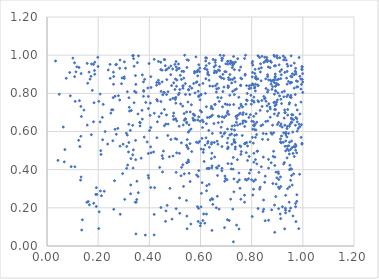
| Category | Series 0 |
|---|---|
| 0.4397582424768291 | 0.85 |
| 0.9306065013908572 | 0.698 |
| 0.45905064466568135 | 0.716 |
| 0.7237459221952459 | 0.629 |
| 0.627939035113636 | 0.539 |
| 0.6833654984516622 | 0.972 |
| 0.8725762796969696 | 0.675 |
| 0.16093497196341988 | 0.233 |
| 0.592542413880383 | 0.197 |
| 0.4730334914781309 | 0.808 |
| 0.8861221907580672 | 0.594 |
| 0.6947858666441654 | 0.339 |
| 0.683654880736637 | 0.394 |
| 0.3955928365395567 | 0.37 |
| 0.5476568008945845 | 0.09 |
| 0.6479818516568191 | 0.218 |
| 0.8899949662903974 | 0.072 |
| 0.7726067595610066 | 0.626 |
| 0.6707475994850652 | 0.827 |
| 0.9288758335606171 | 0.713 |
| 0.9922326241957272 | 0.875 |
| 0.7067391578996007 | 0.706 |
| 0.8201820290631205 | 0.43 |
| 0.6106738642838067 | 0.65 |
| 0.7044417234368779 | 0.54 |
| 0.6294474489301293 | 0.548 |
| 0.5413794025680093 | 0.794 |
| 0.9792913036521915 | 0.862 |
| 0.8780104582182556 | 0.189 |
| 0.37267117728008076 | 0.896 |
| 0.2768716669511784 | 0.616 |
| 0.9480298406155264 | 0.4 |
| 0.6199840227202453 | 0.986 |
| 0.6619571355454509 | 0.913 |
| 0.18266965576157063 | 0.224 |
| 0.8361605614147365 | 0.63 |
| 0.3117633460813789 | 0.522 |
| 0.790365009153304 | 0.839 |
| 0.5014256973000555 | 0.563 |
| 0.801803901243772 | 0.959 |
| 0.7383309946841438 | 0.679 |
| 0.2526202056550569 | 0.713 |
| 0.8339017023034863 | 0.912 |
| 0.6952844717494677 | 0.914 |
| 0.5971870194827564 | 0.933 |
| 0.7336272615109689 | 0.631 |
| 0.5660099925702582 | 0.827 |
| 0.7288850378932779 | 0.957 |
| 0.5933533301236843 | 0.95 |
| 0.6692634076765457 | 0.681 |
| 0.8923122747983209 | 0.901 |
| 0.9721107230061647 | 0.738 |
| 0.8552057277014337 | 0.876 |
| 0.8475790365505581 | 0.784 |
| 0.9308096741542663 | 0.699 |
| 0.6450869756310679 | 0.42 |
| 0.5359674929827138 | 0.694 |
| 0.6190773410810242 | 0.8 |
| 0.8329864053565965 | 0.308 |
| 0.772175240070705 | 0.983 |
| 0.9383104013218859 | 0.953 |
| 0.3350387867544831 | 0.478 |
| 0.5523770347545228 | 0.596 |
| 0.9250413176067294 | 0.975 |
| 0.6000381439607686 | 0.791 |
| 0.4057358930435871 | 0.621 |
| 0.7595085625792112 | 0.495 |
| 0.7986880469913847 | 0.743 |
| 0.6522755969845091 | 0.642 |
| 0.4194467273299296 | 0.696 |
| 0.5466725327784752 | 0.157 |
| 0.7324114684003323 | 0.793 |
| 0.8550696682368828 | 0.653 |
| 0.806328378153701 | 0.844 |
| 0.6020656587611511 | 0.205 |
| 0.4190033491986625 | 0.165 |
| 0.9703848851121417 | 0.794 |
| 0.7326744415356399 | 0.924 |
| 0.9029811242468271 | 0.802 |
| 0.6768479442541693 | 1 |
| 0.4404542227759458 | 0.412 |
| 0.6426695310158304 | 0.458 |
| 0.9472907652219515 | 0.628 |
| 0.7761549709987637 | 1 |
| 0.46326782165340946 | 0.129 |
| 0.128500594103624 | 0.521 |
| 0.45808541655429097 | 0.977 |
| 0.1344220684928971 | 0.679 |
| 0.6714808646532138 | 0.42 |
| 0.9802851968661976 | 0.834 |
| 0.7227599620286055 | 0.533 |
| 0.5476559091503768 | 0.976 |
| 0.4817701208243884 | 0.767 |
| 0.27179629245290976 | 0.952 |
| 0.4582539838530219 | 0.804 |
| 0.5174969212528008 | 0.486 |
| 0.928099881278443 | 0.811 |
| 0.16577344483976106 | 0.216 |
| 0.6108727488720841 | 0.491 |
| 0.31403229731486565 | 0.808 |
| 0.8123347312741905 | 0.904 |
| 0.9943878482873181 | 0.846 |
| 0.5457206383565661 | 0.702 |
| 0.9385067285459505 | 0.462 |
| 0.7283064310556521 | 0.464 |
| 0.5857476662627418 | 0.913 |
| 0.28437573407253375 | 0.765 |
| 0.8476666464722052 | 0.962 |
| 0.4446778232376353 | 0.963 |
| 0.5528912196933847 | 0.973 |
| 0.714909511922426 | 0.899 |
| 0.726097819725797 | 0.193 |
| 0.6582129797654425 | 0.974 |
| 0.9054849382932397 | 0.196 |
| 0.263945958838259 | 0.342 |
| 0.8347812338674323 | 0.955 |
| 0.7441785159034859 | 0.452 |
| 0.5179235221876486 | 0.252 |
| 0.6554074812832449 | 0.918 |
| 0.978014111455429 | 0.602 |
| 0.3197570025185871 | 0.638 |
| 0.5966648548342794 | 0.548 |
| 0.8973264029374248 | 0.752 |
| 0.6834927672056559 | 0.985 |
| 0.6650257340749395 | 0.849 |
| 0.48884590701903197 | 0.141 |
| 0.741009175812642 | 0.109 |
| 0.9049097139846919 | 0.379 |
| 0.5993736760383804 | 0.106 |
| 0.7789724845145493 | 0.489 |
| 0.8029887373958056 | 0.569 |
| 0.20873162991225366 | 0.288 |
| 0.8906480461428249 | 0.882 |
| 0.9135301137160078 | 0.877 |
| 0.8569139575846726 | 0.588 |
| 0.9336825593443574 | 0.582 |
| 0.6648367952596044 | 0.549 |
| 0.6552610683249024 | 0.466 |
| 0.9881876928510416 | 0.626 |
| 0.9717037782528212 | 0.206 |
| 0.2709669070166084 | 0.585 |
| 0.840784952578503 | 0.731 |
| 0.9615437111511197 | 0.157 |
| 0.0752330270776588 | 0.879 |
| 0.6675978947679491 | 0.778 |
| 0.3843443753921758 | 0.057 |
| 0.9098107727249628 | 0.987 |
| 0.886687853121969 | 0.752 |
| 0.3636486608411398 | 0.629 |
| 0.06757905644450751 | 0.441 |
| 0.17415501083521728 | 0.954 |
| 0.8526609079278437 | 0.132 |
| 0.7001294252184086 | 0.912 |
| 0.19301128861674618 | 0.306 |
| 0.6042471286513494 | 0.702 |
| 0.6559565395820836 | 0.742 |
| 0.778521484543587 | 0.691 |
| 0.8671423556707127 | 0.746 |
| 0.9295267946281064 | 0.633 |
| 0.3200716660214945 | 0.542 |
| 0.7292195772132313 | 0.993 |
| 0.13576714626574882 | 0.084 |
| 0.9280402782555909 | 0.437 |
| 0.7940986808306106 | 0.546 |
| 0.7648530476050951 | 0.689 |
| 0.905989669473316 | 0.349 |
| 0.8593733833149108 | 0.987 |
| 0.9290235429054389 | 0.09 |
| 0.6954909473677985 | 0.594 |
| 0.6665997862081255 | 0.37 |
| 0.9726858438960366 | 0.673 |
| 0.8120204125184383 | 0.609 |
| 0.9056504279604051 | 0.875 |
| 0.9547303136482571 | 0.778 |
| 0.22728748999846282 | 0.6 |
| 0.2854671600535836 | 0.523 |
| 0.7078144893543508 | 0.519 |
| 0.9978623721093367 | 0.873 |
| 0.9249161931790494 | 0.593 |
| 0.3405799540827344 | 0.942 |
| 0.28549859494760416 | 0.974 |
| 0.7071028473175551 | 0.565 |
| 0.772064888886028 | 0.266 |
| 0.40088916529883634 | 0.605 |
| 0.8249988537032112 | 0.196 |
| 0.764256107716562 | 0.729 |
| 0.5043405717286213 | 0.966 |
| 0.956470822949223 | 0.857 |
| 0.7178688076475236 | 0.245 |
| 0.5046179421882743 | 0.938 |
| 0.7998688682587701 | 0.347 |
| 0.9561568080405116 | 0.55 |
| 0.405796986752596 | 0.887 |
| 0.06369873648318244 | 0.623 |
| 0.7297657459621126 | 0.741 |
| 0.643721035615434 | 0.41 |
| 0.21626446475492636 | 0.674 |
| 0.8512992015559172 | 0.989 |
| 0.4600756055984458 | 0.977 |
| 0.32280928368547335 | 0.707 |
| 0.7506452984735504 | 0.089 |
| 0.704971641212876 | 0.697 |
| 0.9445942750561502 | 0.59 |
| 0.8130062444618413 | 0.834 |
| 0.4842982283725431 | 0.558 |
| 0.6764771922721993 | 0.887 |
| 0.1907557632537843 | 0.27 |
| 0.13119193756320596 | 0.345 |
| 0.340425235328573 | 0.751 |
| 0.8505088533787807 | 0.772 |
| 0.6076904006754811 | 0.621 |
| 0.7178189693155569 | 0.873 |
| 0.15598364822997682 | 0.229 |
| 0.6004841881846844 | 0.119 |
| 0.5836501632658271 | 0.857 |
| 0.9840563760734663 | 0.091 |
| 0.12527609103149326 | 0.935 |
| 0.5910541176758058 | 0.81 |
| 0.9967520239593749 | 0.538 |
| 0.5417601212198916 | 0.666 |
| 0.536660113120931 | 0.378 |
| 0.7200952417454632 | 0.404 |
| 0.33497940721588515 | 0.633 |
| 0.9532053968276173 | 0.789 |
| 0.24711499053800134 | 0.879 |
| 0.6529362121278061 | 0.939 |
| 0.3575578873032818 | 0.997 |
| 0.9873271934120542 | 0.376 |
| 0.8984598607150192 | 0.357 |
| 0.2075782404318102 | 0.65 |
| 0.8817115414730372 | 0.633 |
| 0.9251681802679272 | 0.43 |
| 0.913402082103097 | 0.144 |
| 0.8148092712689423 | 0.453 |
| 0.6365866434000123 | 0.838 |
| 0.5823099655253737 | 0.991 |
| 0.6024335985289277 | 0.794 |
| 0.9501260295517759 | 0.853 |
| 0.6847414355846674 | 0.678 |
| 0.45287333171246524 | 0.459 |
| 0.9047321245259362 | 0.845 |
| 0.6928400171269505 | 0.673 |
| 0.7749526458169351 | 0.54 |
| 0.7276537164617517 | 0.403 |
| 0.42841625753314244 | 0.842 |
| 0.8869406969678225 | 0.999 |
| 0.6695280034562198 | 0.922 |
| 0.5509173140791381 | 0.755 |
| 0.7575674883557049 | 0.88 |
| 0.8033240132623437 | 0.91 |
| 0.10127520197496556 | 0.984 |
| 0.6140268317693196 | 0.443 |
| 0.6096043672017895 | 0.852 |
| 0.47833119720412726 | 0.468 |
| 0.6746718681869771 | 0.94 |
| 0.4698667691678758 | 0.213 |
| 0.36236454568616333 | 0.648 |
| 0.30380434805095496 | 0.244 |
| 0.7548897008068617 | 0.695 |
| 0.6918806689814829 | 0.587 |
| 0.1995789252691707 | 0.941 |
| 0.7039730214280847 | 0.347 |
| 0.9557090888999689 | 0.369 |
| 0.8213752064961062 | 0.496 |
| 0.7329581750357338 | 0.548 |
| 0.9326393539542939 | 0.174 |
| 0.6953681367594868 | 0.367 |
| 0.5313854888896647 | 0.826 |
| 0.884070524171767 | 0.469 |
| 0.9576853639201416 | 0.515 |
| 0.8135335085496259 | 0.926 |
| 0.9390027333543158 | 0.508 |
| 0.9638244978731638 | 0.378 |
| 0.8797301039294866 | 0.585 |
| 0.7335799470401801 | 0.58 |
| 0.2913126820844504 | 0.85 |
| 0.6384264889476642 | 0.241 |
| 0.9383727708650739 | 0.848 |
| 0.7577195908331642 | 0.48 |
| 0.9378261046701984 | 0.571 |
| 0.9329993775249009 | 0.266 |
| 0.7897527820734499 | 0.825 |
| 0.1322804789881547 | 0.575 |
| 0.8931094928199063 | 0.814 |
| 0.2690088508758282 | 0.95 |
| 0.6860968598795508 | 0.729 |
| 0.6323168391732525 | 0.606 |
| 0.6270578813814057 | 0.673 |
| 0.7401320176136307 | 0.648 |
| 0.43149100870509427 | 0.651 |
| 0.9270412657977214 | 0.67 |
| 0.8909109748626789 | 0.466 |
| 0.3818133725040228 | 0.873 |
| 0.10767000283172662 | 0.96 |
| 0.6164502444612769 | 0.93 |
| 0.04277510151570869 | 0.449 |
| 0.9383155314214834 | 0.615 |
| 0.5599288610829584 | 0.703 |
| 0.7339793131148543 | 0.817 |
| 0.8663436219162478 | 0.135 |
| 0.3940512308593839 | 0.828 |
| 0.4354093628040043 | 0.968 |
| 0.6585926227296713 | 0.84 |
| 0.907486193780197 | 0.949 |
| 0.9478239562979881 | 0.544 |
| 0.9721366931927745 | 0.912 |
| 0.8948887928138027 | 0.811 |
| 0.558103736442747 | 0.794 |
| 0.903756483611857 | 0.388 |
| 0.5468694376664684 | 0.936 |
| 0.9635302784001093 | 0.662 |
| 0.9644842453515979 | 0.521 |
| 0.7721972538403773 | 0.536 |
| 0.6214975960028959 | 0.567 |
| 0.20258668387123918 | 0.758 |
| 0.6342073030580457 | 0.957 |
| 0.5009856217987457 | 0.774 |
| 0.9373905382287913 | 0.783 |
| 0.8140254716205799 | 0.639 |
| 0.6413728795622653 | 0.722 |
| 0.1323585290870167 | 0.731 |
| 0.7801532112422994 | 0.765 |
| 0.15735276555535976 | 0.634 |
| 0.900574054337971 | 0.636 |
| 0.966599307594584 | 0.958 |
| 0.4503115197978316 | 0.473 |
| 0.27915740293504526 | 0.788 |
| 0.20406522393300977 | 0.179 |
| 0.048002066363245215 | 0.795 |
| 0.863275429781671 | 0.655 |
| 0.5365755803726542 | 0.659 |
| 0.7633150451915186 | 0.579 |
| 0.7722121767343232 | 0.229 |
| 0.42956704102181137 | 0.567 |
| 0.7306973728610897 | 0.352 |
| 0.7364073712718966 | 0.964 |
| 0.641016004079567 | 0.679 |
| 0.9113689854145689 | 0.168 |
| 0.9193591676338525 | 0.623 |
| 0.6844919243712689 | 0.574 |
| 0.5223886270704037 | 0.745 |
| 0.9658052426322717 | 0.898 |
| 0.6346642572054112 | 0.517 |
| 0.8732332223941051 | 0.969 |
| 0.33745249567191776 | 0.998 |
| 0.9528447538738447 | 0.405 |
| 0.790230808259809 | 0.469 |
| 0.5309175241245954 | 0.426 |
| 0.7669183985114635 | 0.699 |
| 0.6236419253433851 | 0.289 |
| 0.7574282411804071 | 0.521 |
| 0.888906339003526 | 0.944 |
| 0.09125663644659217 | 0.787 |
| 0.8893547025487426 | 0.214 |
| 0.8616971853195803 | 0.806 |
| 0.925804261104407 | 0.782 |
| 0.8086095876797492 | 0.439 |
| 0.8660820194980356 | 0.408 |
| 0.31021970955999456 | 0.591 |
| 0.5905454488080464 | 0.922 |
| 0.511677647508238 | 0.929 |
| 0.4050015646725836 | 0.519 |
| 0.8909879497326996 | 0.735 |
| 0.807615867350336 | 0.651 |
| 0.9143068638427397 | 0.769 |
| 0.9300447147616225 | 0.987 |
| 0.5719408606368248 | 0.691 |
| 0.658749520598123 | 0.946 |
| 0.3771929921947803 | 0.784 |
| 0.31400644686461987 | 0.581 |
| 0.5022559265387744 | 0.875 |
| 0.9317662481246844 | 0.198 |
| 0.5735837317458974 | 0.689 |
| 0.34584374171806487 | 0.893 |
| 0.377754419086543 | 0.815 |
| 0.9306590191834921 | 0.523 |
| 0.6875705143875184 | 0.809 |
| 0.8269690435156477 | 0.756 |
| 0.7310768682445552 | 0.544 |
| 0.16813161498970658 | 0.874 |
| 0.40553789429519205 | 0.307 |
| 0.6231406454349024 | 0.641 |
| 0.5983551639823474 | 0.766 |
| 0.7449677804589271 | 0.633 |
| 0.8650427792334697 | 0.938 |
| 0.6477471133566293 | 0.837 |
| 0.7071818943540101 | 0.953 |
| 0.9413620759191175 | 0.942 |
| 0.8896786310614159 | 0.87 |
| 0.8075012633479544 | 0.759 |
| 0.6838753749929544 | 0.521 |
| 0.899172732252995 | 0.997 |
| 0.5984717712034879 | 0.654 |
| 0.7169331959878289 | 0.955 |
| 0.7077388127858865 | 0.831 |
| 0.8837314683452675 | 0.868 |
| 0.6968024377208917 | 0.744 |
| 0.46419912556103327 | 0.922 |
| 0.7217553941247067 | 0.854 |
| 0.727199028557434 | 0.961 |
| 0.7514422067314047 | 0.723 |
| 0.5929545219011392 | 0.677 |
| 0.7910412057631161 | 0.382 |
| 0.7257643552894264 | 0.946 |
| 0.6064049901106701 | 0.332 |
| 0.6622374903368426 | 0.909 |
| 0.7353053690954604 | 0.86 |
| 0.9760382143322068 | 0.488 |
| 0.9364601292404071 | 0.88 |
| 0.5779525101868769 | 0.659 |
| 0.9764525048838149 | 0.667 |
| 0.2573327728150806 | 0.551 |
| 0.5702004911179603 | 0.67 |
| 0.09437030183568973 | 0.416 |
| 0.5080295730922351 | 0.869 |
| 0.8664512950473483 | 0.87 |
| 0.19862493518261815 | 0.989 |
| 0.9543460136038999 | 0.996 |
| 0.39591630602648303 | 0.485 |
| 0.5348402828142416 | 0.88 |
| 0.7497746006931828 | 0.779 |
| 0.9767573279313749 | 0.269 |
| 0.7828862827491727 | 0.799 |
| 0.9958225264964806 | 0.926 |
| 0.8444046191148235 | 0.181 |
| 0.5562537895796988 | 0.604 |
| 0.45492366267047624 | 0.497 |
| 0.7752794716475954 | 0.349 |
| 0.8925721100044943 | 0.888 |
| 0.7139379317727739 | 0.74 |
| 0.3782078684789347 | 0.811 |
| 0.5458536222928128 | 0.649 |
| 0.774359293058749 | 0.895 |
| 0.6991214328752569 | 0.954 |
| 0.3533247935655623 | 0.961 |
| 0.20997098180163556 | 0.5 |
| 0.9995302081348104 | 0.859 |
| 0.7802727511111209 | 0.345 |
| 0.2660563952142053 | 0.785 |
| 0.612127321763619 | 0.506 |
| 0.9717304232193864 | 0.502 |
| 0.5991131155535181 | 0.71 |
| 0.14441217314347402 | 0.712 |
| 0.9057536938091564 | 0.696 |
| 0.16443372750943527 | 0.911 |
| 0.6493858697671615 | 0.977 |
| 0.9449945537182584 | 0.525 |
| 0.9550965893297102 | 0.67 |
| 0.6534009197847379 | 0.907 |
| 0.3714163061043407 | 0.711 |
| 0.9661543551997518 | 0.827 |
| 0.5552788745730051 | 0.635 |
| 0.9885584063460031 | 0.692 |
| 0.6680577492714033 | 0.533 |
| 0.9447030185513792 | 0.5 |
| 0.6073600719967427 | 0.66 |
| 0.8085145129333529 | 0.486 |
| 0.5064105209721986 | 0.921 |
| 0.5061868303599949 | 0.837 |
| 0.4525208417623794 | 0.792 |
| 0.5066500152016172 | 0.488 |
| 0.7211981398417424 | 0.431 |
| 0.5453339862194542 | 0.528 |
| 0.9699580513113201 | 0.916 |
| 0.3680944734384801 | 0.46 |
| 0.9568231733893174 | 0.665 |
| 0.7566279123156068 | 0.842 |
| 0.6623454993203645 | 0.411 |
| 0.8623161462387768 | 0.888 |
| 0.576368646710749 | 0.907 |
| 0.7991223092247441 | 0.843 |
| 0.5073190716734 | 0.559 |
| 0.7285762267821341 | 0.022 |
| 0.5556260725051432 | 0.381 |
| 0.7548461778026151 | 0.639 |
| 0.7094715485555365 | 0.835 |
| 0.6324249347674801 | 0.896 |
| 0.9327216717150141 | 0.498 |
| 0.5623190617868857 | 0.115 |
| 0.11670459450904669 | 0.939 |
| 0.5933334121029632 | 0.786 |
| 0.5911982141877167 | 0.541 |
| 0.8772266558133017 | 0.862 |
| 0.8956918027311016 | 0.741 |
| 0.10902680532328327 | 0.415 |
| 0.6437336374317945 | 0.543 |
| 0.8008972789323073 | 0.763 |
| 0.4735554824061505 | 0.639 |
| 0.5017908197074367 | 0.768 |
| 0.6479259949366393 | 0.245 |
| 0.35569491826592486 | 0.692 |
| 0.6994402329345224 | 0.682 |
| 0.44741831551215067 | 0.695 |
| 0.588119265435381 | 0.206 |
| 0.4952048128694363 | 0.697 |
| 0.7660489869024587 | 0.655 |
| 0.7449105299165746 | 0.336 |
| 0.6425418710658981 | 0.534 |
| 0.7076771760443981 | 0.839 |
| 0.8971088044200781 | 0.844 |
| 0.5036670099445745 | 0.748 |
| 0.35691960533679784 | 0.28 |
| 0.7970808545523853 | 0.79 |
| 0.7047147400772913 | 0.741 |
| 0.9393174665378741 | 0.523 |
| 0.9821393435837774 | 0.616 |
| 0.8331046888662332 | 0.711 |
| 0.9853371174019026 | 0.639 |
| 0.9092017239550689 | 0.787 |
| 0.7877520503893366 | 0.353 |
| 0.4515248126605207 | 0.388 |
| 0.7057699002690104 | 0.967 |
| 0.858401886105906 | 0.976 |
| 0.6724051224375442 | 0.678 |
| 0.49520854850770696 | 0.855 |
| 0.6257871621664433 | 0.406 |
| 0.5520140914185067 | 0.51 |
| 0.6859914005234733 | 0.983 |
| 0.9583485420458052 | 0.32 |
| 0.5926095680074123 | 0.783 |
| 0.8957794562277853 | 0.324 |
| 0.2586587460809253 | 0.777 |
| 0.7963676716264636 | 0.399 |
| 0.8925022271983564 | 0.837 |
| 0.20210926118341077 | 0.091 |
| 0.8619033738934636 | 0.707 |
| 0.7540042189656043 | 0.525 |
| 0.565564556125157 | 0.495 |
| 0.8990476181887813 | 0.871 |
| 0.8312559500308712 | 0.298 |
| 0.3017467832823765 | 0.886 |
| 0.6977476467204735 | 0.353 |
| 0.8377003498734362 | 0.934 |
| 0.547340582560207 | 0.437 |
| 0.8508955842159112 | 0.334 |
| 0.4287190629268465 | 0.857 |
| 0.940922843552737 | 0.686 |
| 0.8242742092570335 | 0.761 |
| 0.7544634026481551 | 0.302 |
| 0.17715394481415841 | 0.816 |
| 0.2973707125061305 | 0.533 |
| 0.3185987199246789 | 0.493 |
| 0.8143177793328796 | 0.88 |
| 0.8162364740971702 | 0.888 |
| 0.8303852502249235 | 0.988 |
| 0.9854633110000619 | 0.988 |
| 0.956537271071971 | 0.689 |
| 0.22366002756531614 | 0.287 |
| 0.9106070608501289 | 0.915 |
| 0.7807477279601323 | 0.542 |
| 0.8762427272847193 | 0.436 |
| 0.5344627606167861 | 0.914 |
| 0.8255471987557786 | 0.84 |
| 0.5034640079121577 | 0.779 |
| 0.3068609239454137 | 0.931 |
| 0.8887930224161574 | 0.856 |
| 0.8470272622844268 | 0.193 |
| 0.6328866432808256 | 0.406 |
| 0.7505800263541649 | 0.69 |
| 0.49974601882258934 | 0.952 |
| 0.8186284859397923 | 0.876 |
| 0.39910678506194164 | 0.956 |
| 0.7891155428104654 | 0.674 |
| 0.4040487585549022 | 0.749 |
| 0.1866974013666697 | 0.963 |
| 0.8067630218850814 | 0.632 |
| 0.5768761316892562 | 0.915 |
| 0.4835448475793458 | 0.898 |
| 0.7107364259470631 | 0.871 |
| 0.8465838436708267 | 0.241 |
| 0.3487421172283794 | 0.23 |
| 0.6575325025850626 | 0.742 |
| 0.8242019116861888 | 0.876 |
| 0.23944088583046516 | 0.923 |
| 0.5209410717153448 | 0.895 |
| 0.9568597731290482 | 0.648 |
| 0.9046994722486161 | 0.308 |
| 0.6222792906805105 | 0.945 |
| 0.32972805708251 | 0.71 |
| 0.4032028552107226 | 0.685 |
| 0.4573059051262478 | 0.806 |
| 0.8976738568246455 | 0.852 |
| 0.8901750081580033 | 0.422 |
| 0.9335465145350124 | 0.596 |
| 0.7360768964952152 | 0.543 |
| 0.23723640328683065 | 0.534 |
| 0.504775214650162 | 0.386 |
| 0.8771006727124563 | 0.963 |
| 0.5837366380804777 | 0.544 |
| 0.7760323166920454 | 0.537 |
| 0.436910383225852 | 0.855 |
| 0.2129153464970628 | 0.263 |
| 0.11299510689083399 | 0.912 |
| 0.6477328736530771 | 0.719 |
| 0.7050443432663019 | 0.138 |
| 0.7330664650047649 | 0.608 |
| 0.8230293854156107 | 0.497 |
| 0.644495271912072 | 0.248 |
| 0.7143759147095476 | 0.581 |
| 0.39749687386849464 | 0.356 |
| 0.9745924668387753 | 0.865 |
| 0.9437029654439902 | 0.862 |
| 0.950456811035251 | 0.78 |
| 0.6319804681746662 | 0.407 |
| 0.311200734451991 | 0.407 |
| 0.48054610717710905 | 0.302 |
| 0.1720832573118226 | 0.889 |
| 0.3421369431141265 | 0.811 |
| 0.49996521092571194 | 0.82 |
| 0.6242338878570604 | 0.316 |
| 0.6632013986250631 | 0.823 |
| 0.3800041619326859 | 0.571 |
| 0.4501027722646903 | 0.86 |
| 0.9295550527359767 | 0.91 |
| 0.5303845328599232 | 0.733 |
| 0.18165480514217458 | 0.951 |
| 0.46867976010567186 | 0.926 |
| 0.644592514138406 | 0.082 |
| 0.8621724792119373 | 0.972 |
| 0.416761075847265 | 0.493 |
| 0.34623242978135393 | 0.553 |
| 0.2605842254949567 | 0.888 |
| 0.9962677664694655 | 0.939 |
| 0.8403045926779702 | 0.994 |
| 0.9323778217305586 | 0.188 |
| 0.7124481829154162 | 0.134 |
| 0.36429881252080065 | 0.645 |
| 0.2112542071559908 | 0.48 |
| 0.9612299437373506 | 0.687 |
| 0.2657662263110686 | 0.611 |
| 0.9418571195767648 | 0.791 |
| 0.6179502711275329 | 0.929 |
| 0.7578994285825571 | 0.743 |
| 0.327365576610013 | 0.32 |
| 0.9546409817547337 | 0.648 |
| 0.8948256467352117 | 0.387 |
| 0.9403848864414255 | 0.301 |
| 0.9992244569010617 | 0.904 |
| 0.6735806428860701 | 0.758 |
| 0.91174186795795 | 0.63 |
| 0.44520372025370275 | 0.757 |
| 0.7362872518030178 | 0.519 |
| 0.7356875143673933 | 0.508 |
| 0.9980912248731872 | 0.939 |
| 0.9482419533691643 | 0.751 |
| 0.8613060839913339 | 0.966 |
| 0.8851931614268699 | 0.867 |
| 0.47222594936327955 | 0.579 |
| 0.8884839477979161 | 0.692 |
| 0.4063235417693632 | 0.831 |
| 0.7570926139032974 | 0.938 |
| 0.8369572550549146 | 0.866 |
| 0.9137457279278554 | 0.312 |
| 0.08859858180728693 | 0.909 |
| 0.872966014179253 | 0.869 |
| 0.3476316560728441 | 0.063 |
| 0.5956426379460177 | 0.844 |
| 0.5643777180042086 | 0.74 |
| 0.9733828573492266 | 0.901 |
| 0.8102114013204098 | 0.629 |
| 0.8110221468609817 | 0.828 |
| 0.37703341297063736 | 0.86 |
| 0.2601298517258737 | 0.847 |
| 0.39627088603439037 | 0.72 |
| 0.4645718292059551 | 0.639 |
| 0.5322964775590321 | 0.634 |
| 0.971720359207996 | 0.223 |
| 0.828283234956335 | 0.929 |
| 0.9235486080579157 | 0.544 |
| 0.8192832985253917 | 0.584 |
| 0.6178068231238305 | 0.529 |
| 0.7420442791326882 | 0.667 |
| 0.6621381188252041 | 0.806 |
| 0.705275431042495 | 0.51 |
| 0.33663486782665725 | 0.409 |
| 0.4909889721340182 | 0.928 |
| 0.5631113868096896 | 0.613 |
| 0.19267355064163386 | 0.207 |
| 0.9349211647425589 | 0.974 |
| 0.133302191504126 | 0.362 |
| 0.7260575796304463 | 0.873 |
| 0.6939376778171334 | 0.096 |
| 0.5594221971750233 | 0.338 |
| 0.7428242243010414 | 0.682 |
| 0.8729187189956303 | 0.718 |
| 0.8094227918931025 | 0.754 |
| 0.8168172732015406 | 0.608 |
| 0.6207689159229719 | 0.876 |
| 0.8898141452376609 | 0.993 |
| 0.5893560960215231 | 0.892 |
| 0.28627827447174137 | 0.166 |
| 0.6427418379634366 | 0.732 |
| 0.7591213765107552 | 0.734 |
| 0.8170087731460449 | 0.694 |
| 0.8759583461624324 | 0.848 |
| 0.2077622522866688 | 0.796 |
| 0.5048049093934597 | 0.195 |
| 0.7453958149330172 | 0.982 |
| 0.6658065498936202 | 0.261 |
| 0.777603287251048 | 0.743 |
| 0.4068578257419469 | 0.488 |
| 0.7175591960425473 | 0.959 |
| 0.6202454242485174 | 0.97 |
| 0.8755238967916023 | 0.593 |
| 0.9201375707887172 | 0.206 |
| 0.8621520061181469 | 0.897 |
| 0.8451597999123093 | 0.59 |
| 0.5530131206307651 | 0.82 |
| 0.961723604637486 | 0.485 |
| 0.946492461997466 | 0.743 |
| 0.3348748120445132 | 0.997 |
| 0.6350410811866388 | 0.674 |
| 0.8422588170065753 | 0.559 |
| 0.6335825486636922 | 0.869 |
| 0.7082168186154038 | 0.513 |
| 0.9933596558900214 | 0.569 |
| 0.5138031759075337 | 0.793 |
| 0.5467635806881079 | 0.436 |
| 0.7840028714003007 | 0.524 |
| 0.8041424105698766 | 0.612 |
| 0.4922677766252274 | 0.774 |
| 0.06983769454853675 | 0.505 |
| 0.48420844665144464 | 0.943 |
| 0.13340483157331254 | 0.904 |
| 0.7968631135178891 | 0.827 |
| 0.44969431904667123 | 0.921 |
| 0.8021104582670051 | 0.154 |
| 0.44594909484184897 | 0.81 |
| 0.538157073676725 | 1 |
| 0.9158504324107183 | 0.897 |
| 0.4682330553684578 | 0.872 |
| 0.5933154368747932 | 0.395 |
| 0.9521395703346948 | 0.199 |
| 0.6746321593508933 | 0.919 |
| 0.8907479290786313 | 0.754 |
| 0.476297036440389 | 0.934 |
| 0.8644814675660629 | 0.816 |
| 0.795018591606048 | 0.688 |
| 0.18658398698005563 | 0.9 |
| 0.9927157071406891 | 0.754 |
| 0.7257121385243984 | 0.811 |
| 0.949853619686599 | 0.638 |
| 0.8396831052263438 | 0.763 |
| 0.4937443197679632 | 0.681 |
| 0.5189981322133586 | 0.171 |
| 0.43804325408194483 | 0.678 |
| 0.1237868423368455 | 0.554 |
| 0.5337455050497082 | 0.312 |
| 0.7732741553929248 | 0.655 |
| 0.9541614533784325 | 0.945 |
| 0.7304740959050776 | 0.284 |
| 0.9995078395184136 | 0.805 |
| 0.9334726860148049 | 0.591 |
| 0.757063770730143 | 0.84 |
| 0.5892980332181431 | 0.66 |
| 0.6239790107095271 | 0.985 |
| 0.806533300820085 | 0.539 |
| 0.8562839004120061 | 0.758 |
| 0.6091898707371303 | 0.134 |
| 0.7309153681154232 | 0.557 |
| 0.5239793626573284 | 0.368 |
| 0.5962536949594691 | 0.914 |
| 0.5320033740086024 | 0.84 |
| 0.6463834333019265 | 0.59 |
| 0.6824510637726816 | 0.88 |
| 0.8532858706209441 | 0.968 |
| 0.466890774928336 | 0.687 |
| 0.5015214898443082 | 0.666 |
| 0.9386127625587058 | 0.915 |
| 0.1818278452666692 | 0.651 |
| 0.9125562054713491 | 0.561 |
| 0.8147889042655404 | 0.569 |
| 0.2174109215128717 | 0.557 |
| 0.3203525949323387 | 0.777 |
| 0.9575065169603105 | 0.886 |
| 0.8149092956961028 | 0.347 |
| 0.8080417138228706 | 0.339 |
| 0.5460370611439309 | 0.645 |
| 0.2575581327384289 | 0.714 |
| 0.8430546368999491 | 0.636 |
| 0.8562250196668031 | 0.825 |
| 0.6337278961517178 | 0.323 |
| 0.7327274899987493 | 0.88 |
| 0.418808314946449 | 0.058 |
| 0.5453256101222822 | 0.239 |
| 0.6230153798376021 | 0.73 |
| 0.45895856094142357 | 0.63 |
| 0.586178920746704 | 0.913 |
| 0.9476085069585245 | 0.184 |
| 0.6810200843482893 | 0.777 |
| 0.5538055160612624 | 0.818 |
| 0.7074595878100012 | 0.969 |
| 0.8073549363812031 | 0.298 |
| 0.7220448070139815 | 0.963 |
| 0.5074525069156993 | 0.655 |
| 0.3217242322346737 | 0.727 |
| 0.540875811651307 | 0.851 |
| 0.837832521776528 | 0.415 |
| 0.2934285099008445 | 0.88 |
| 0.7649450348927029 | 0.643 |
| 0.8857655301277881 | 0.496 |
| 0.6057605316074816 | 0.564 |
| 0.8827029027630283 | 0.327 |
| 0.8931201773207544 | 0.945 |
| 0.7094937493686637 | 0.882 |
| 0.3022782553543974 | 0.878 |
| 0.4446094717472335 | 0.924 |
| 0.949489513831473 | 0.423 |
| 0.6875989400381544 | 0.9 |
| 0.7613300228902281 | 0.876 |
| 0.8023339602322634 | 0.886 |
| 0.978014412338621 | 0.651 |
| 0.3450957916923665 | 0.229 |
| 0.4673126322330022 | 0.794 |
| 0.17345078409536957 | 0.583 |
| 0.7577277820827997 | 0.245 |
| 0.9167035132949463 | 0.577 |
| 0.7437790606781199 | 0.682 |
| 0.5480328639390203 | 0.519 |
| 0.6168686541367934 | 0.12 |
| 0.548222886049759 | 0.557 |
| 0.3725473243576014 | 0.665 |
| 0.4289216288452852 | 0.768 |
| 0.7073504410382081 | 0.432 |
| 0.9155121200371235 | 0.54 |
| 0.5584970628229554 | 0.836 |
| 0.9409746820306639 | 0.715 |
| 0.9233849184984784 | 0.996 |
| 0.6839111731377995 | 0.407 |
| 0.5260590208858767 | 0.412 |
| 0.5138024056278241 | 0.954 |
| 0.21962146534489121 | 0.742 |
| 0.9523628338408385 | 0.344 |
| 0.5404165295305684 | 0.666 |
| 0.6910468042144728 | 0.877 |
| 0.8247666001077005 | 0.997 |
| 0.11011543681073294 | 0.758 |
| 0.9605885289899775 | 0.597 |
| 0.9389271772151265 | 0.627 |
| 0.5589858372275256 | 0.537 |
| 0.6906507371009042 | 0.998 |
| 0.9665438454920194 | 0.469 |
| 0.9081943266447032 | 0.301 |
| 0.9558395846733504 | 0.403 |
| 0.44538533995865454 | 0.202 |
| 0.6538299870807626 | 0.542 |
| 0.033489048494669306 | 0.969 |
| 0.7773612932801046 | 0.651 |
| 0.34792741690712403 | 0.804 |
| 0.947892990913374 | 0.31 |
| 0.8603322301576767 | 0.735 |
| 0.7105797961904127 | 0.689 |
| 0.6916182393623335 | 0.833 |
| 0.9966179283071969 | 0.534 |
| 0.33744074996769463 | 0.504 |
| 0.740452042706678 | 0.823 |
| 0.9972434786436477 | 0.925 |
| 0.8235801450223379 | 0.844 |
| 0.8942411960031602 | 0.259 |
| 0.6232358389713 | 0.167 |
| 0.10796768699462943 | 0.887 |
| 0.42061604482088744 | 0.306 |
| 0.9170490674212665 | 0.747 |
| 0.6260260254771314 | 0.924 |
| 0.8889123396431055 | 0.796 |
| 0.9590873614845679 | 0.903 |
| 0.6278572914158029 | 0.901 |
| 0.8004431164709925 | 0.655 |
| 0.5189521103291255 | 0.82 |
| 0.8043839887020959 | 0.948 |
| 0.8722243315991506 | 0.934 |
| 0.9735645157115418 | 0.525 |
| 0.9764552800943721 | 0.234 |
| 0.7242749479779411 | 0.934 |
| 0.6445266880814416 | 0.487 |
| 0.18381837954890518 | 0.751 |
| 0.7799959867125322 | 0.84 |
| 0.8082595890445362 | 0.679 |
| 0.43544475586882514 | 0.869 |
| 0.8455183954200568 | 0.466 |
| 0.5027282233334013 | 0.666 |
| 0.8146956731913063 | 0.848 |
| 0.973094316889477 | 0.128 |
| 0.6616830199792577 | 0.2 |
| 0.9470956727152742 | 0.482 |
| 0.5171343896802044 | 0.801 |
| 0.7177658361550081 | 0.969 |
| 0.7213166270721716 | 0.587 |
| 0.970667553392707 | 0.533 |
| 0.7518375704654686 | 0.346 |
| 0.7143532341143527 | 0.79 |
| 0.8794163397296221 | 0.821 |
| 0.3467031727184156 | 0.452 |
| 0.3508997115567854 | 0.243 |
| 0.9466343012110967 | 0.229 |
| 0.8143813018838746 | 0.812 |
| 0.6845257887501146 | 0.65 |
| 0.8088063251504914 | 0.78 |
| 0.8636845517800044 | 0.557 |
| 0.8817013203471151 | 0.835 |
| 0.7056477909645301 | 0.613 |
| 0.6465612608645311 | 0.685 |
| 0.25971798355661635 | 0.911 |
| 0.5166012627386302 | 0.627 |
| 0.9782351428691162 | 0.713 |
| 0.573265218787338 | 0.852 |
| 0.5254936925397099 | 0.873 |
| 0.8192887171416556 | 0.875 |
| 0.6726502550569595 | 0.193 |
| 0.9148660134739681 | 0.64 |
| 0.7212999643441043 | 0.611 |
| 0.8898458681324567 | 0.715 |
| 0.9004279604582944 | 0.985 |
| 0.9052876243664841 | 0.648 |
| 0.8202781889369216 | 0.649 |
| 0.9190408756940127 | 0.807 |
| 0.12684940052005328 | 0.762 |
| 0.419099468557064 | 0.978 |
| 0.6287338177879027 | 0.911 |
| 0.9169280740536108 | 0.924 |
| 0.657807448870237 | 0.962 |
| 0.5539035868962844 | 0.441 |
| 0.29550002998377534 | 0.379 |
| 0.552417930008006 | 0.451 |
| 0.8045408267426597 | 0.267 |
| 0.6788711225805009 | 0.593 |
| 0.7747563798376504 | 0.9 |
| 0.35150841066211713 | 0.339 |
| 0.7503704642648833 | 0.383 |
| 0.8656866392209147 | 0.454 |
| 0.9698186650068339 | 0.518 |
| 0.19536085674648349 | 0.27 |
| 0.8525534227391021 | 0.775 |
| 0.4947591321048596 | 0.663 |
| 0.8282967820152823 | 0.386 |
| 0.32817776468511717 | 0.458 |
| 0.3473025794501584 | 0.847 |
| 0.9718754580400603 | 0.931 |
| 0.49262276727539844 | 0.471 |
| 0.6025261351917022 | 0.508 |
| 0.5726400433543731 | 0.659 |
| 0.5786761455482756 | 0.802 |
| 0.952309636765673 | 0.506 |
| 0.9528452640400423 | 0.89 |
| 0.6122415963679831 | 0.168 |
| 0.2609679908207949 | 0.192 |
| 0.527407406728812 | 0.915 |
| 0.8531502377542037 | 0.366 |
| 0.6806823834204139 | 0.622 |
| 0.4650567208252065 | 0.184 |
| 0.7518178355876297 | 0.921 |
| 0.486938215027406 | 0.841 |
| 0.7287734555930822 | 0.953 |
| 0.665215827629961 | 0.408 |
| 0.7409995520905843 | 0.583 |
| 0.7827542708630423 | 0.762 |
| 0.28430681890094106 | 0.931 |
| 0.9761076894360614 | 0.833 |
| 0.5861413275067439 | 0.86 |
| 0.30253458774542374 | 0.965 |
| 0.6696760551301766 | 0.646 |
| 0.5311164434531087 | 0.838 |
| 0.13810682073401723 | 0.137 |
| 0.577296883736079 | 0.684 |
| 0.988305293451257 | 0.889 |
| 0.901126526923312 | 0.683 |
| 0.3958585890747581 | 0.784 |
| 0.8717099659200133 | 0.728 |
| 0.33856854892542015 | 0.982 |
| 0.8037793109993967 | 0.967 |
| 0.24641497532381446 | 0.952 |
| 0.39149942492417017 | 0.545 |
| 0.9947328441589471 | 0.636 |
| 0.4623706695900872 | 0.945 |
| 0.7839663652315285 | 0.448 |
| 0.5910760848537194 | 0.129 |
| 0.6036691925816257 | 0.276 |
| 0.315216659223802 | 0.424 |
| 0.24950509288538497 | 0.696 |
| 0.584940134712671 | 0.372 |
| 0.9528181799513848 | 0.857 |
| 0.1572286794652535 | 0.957 |
| 0.4316444368287539 | 0.76 |
| 0.8037479963582684 | 0.85 |
| 0.5741418528922279 | 0.661 |
| 0.18549605314117773 | 0.92 |
| 0.8934301330707741 | 0.715 |
| 0.15909557345145214 | 0.853 |
| 0.992688458082725 | 0.822 |
| 0.5167845511382573 | 0.931 |
| 0.5904768026662741 | 0.364 |
| 0.38614294471954796 | 0.752 |
| 0.9333755982310056 | 0.55 |
| 0.9006680463352064 | 0.765 |
| 0.3256839703031604 | 0.606 |
| 0.5253256666445097 | 0.541 |
| 0.912617119878566 | 0.362 |
| 0.9126005097909003 | 0.545 |
| 0.971203370368637 | 0.633 |
| 0.326836295466762 | 0.274 |